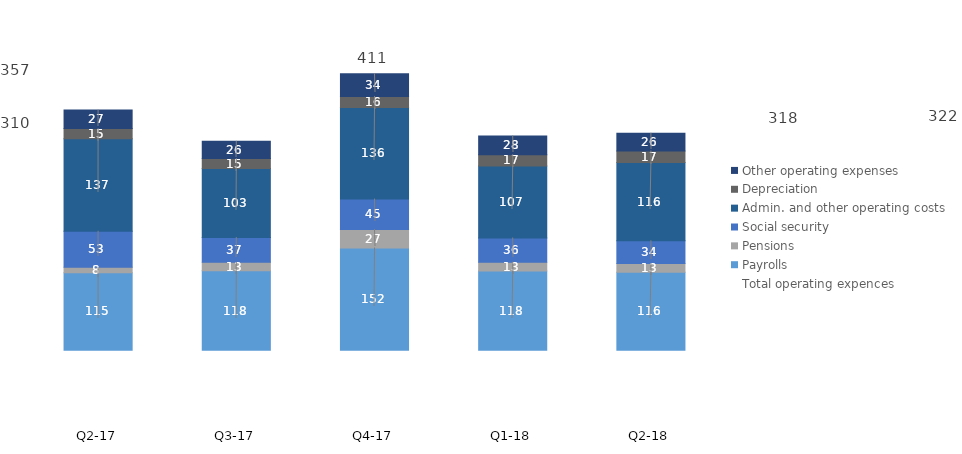
| Category | Payrolls | Pensions | Social security | Admin. and other operating costs | Depreciation | Other operating expenses |
|---|---|---|---|---|---|---|
| Q2-18 | 115.69 | 12.848 | 33.982 | 116.179 | 17.17 | 26.198 |
| Q1-18 | 117.7 | 13 | 35.9 | 107 | 16.7 | 27.8 |
| Q4-17 | 151.8 | 27.4 | 45.2 | 136 | 16.4 | 33.9 |
| Q3-17 | 117.8 | 12.6 | 36.8 | 102.6 | 14.8 | 25.6 |
| Q2-17 | 114.9 | 8.4 | 53.3 | 137.4 | 15.1 | 27.4 |